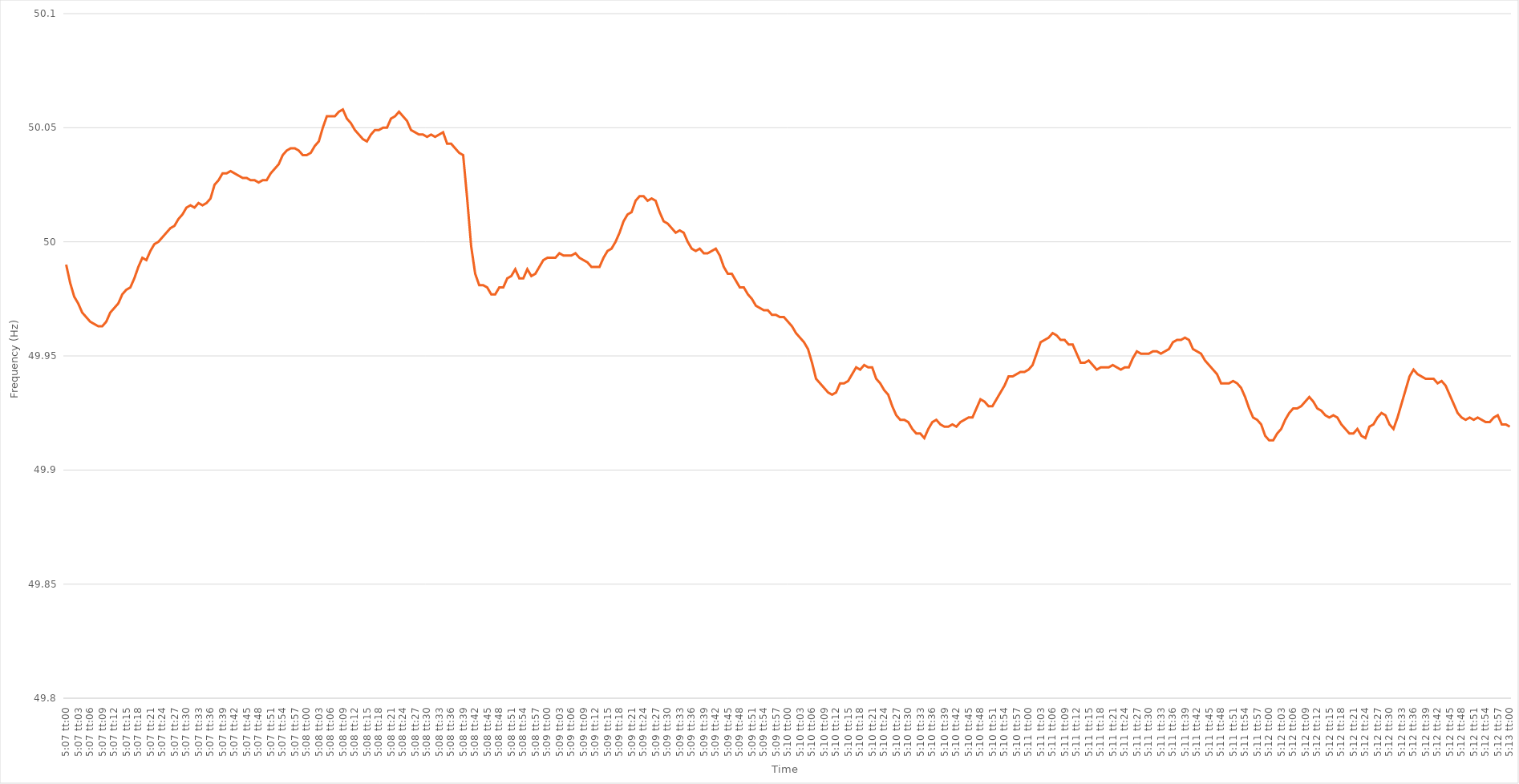
| Category | Series 0 |
|---|---|
| 0.21319444444444444 | 49.99 |
| 0.2132060185185185 | 49.982 |
| 0.21321759259259257 | 49.976 |
| 0.21322916666666666 | 49.973 |
| 0.21324074074074073 | 49.969 |
| 0.2132523148148148 | 49.967 |
| 0.2132638888888889 | 49.965 |
| 0.21327546296296296 | 49.964 |
| 0.21328703703703702 | 49.963 |
| 0.21329861111111112 | 49.963 |
| 0.21331018518518519 | 49.965 |
| 0.21332175925925925 | 49.969 |
| 0.21333333333333335 | 49.971 |
| 0.2133449074074074 | 49.973 |
| 0.21335648148148148 | 49.977 |
| 0.21336805555555557 | 49.979 |
| 0.21337962962962964 | 49.98 |
| 0.2133912037037037 | 49.984 |
| 0.2134027777777778 | 49.989 |
| 0.21341435185185187 | 49.993 |
| 0.2134259259259259 | 49.992 |
| 0.21343749999999997 | 49.996 |
| 0.21344907407407407 | 49.999 |
| 0.21346064814814814 | 50 |
| 0.2134722222222222 | 50.002 |
| 0.2134837962962963 | 50.004 |
| 0.21349537037037036 | 50.006 |
| 0.21350694444444443 | 50.007 |
| 0.21351851851851852 | 50.01 |
| 0.2135300925925926 | 50.012 |
| 0.21354166666666666 | 50.015 |
| 0.21355324074074075 | 50.016 |
| 0.21356481481481482 | 50.015 |
| 0.21357638888888889 | 50.017 |
| 0.21358796296296298 | 50.016 |
| 0.21359953703703705 | 50.017 |
| 0.2136111111111111 | 50.019 |
| 0.2136226851851852 | 50.025 |
| 0.21363425925925927 | 50.027 |
| 0.21364583333333334 | 50.03 |
| 0.21365740740740743 | 50.03 |
| 0.21366898148148147 | 50.031 |
| 0.21368055555555554 | 50.03 |
| 0.2136921296296296 | 50.029 |
| 0.2137037037037037 | 50.028 |
| 0.21371527777777777 | 50.028 |
| 0.21372685185185183 | 50.027 |
| 0.21373842592592593 | 50.027 |
| 0.21375 | 50.026 |
| 0.21376157407407406 | 50.027 |
| 0.21377314814814816 | 50.027 |
| 0.21378472222222222 | 50.03 |
| 0.2137962962962963 | 50.032 |
| 0.21380787037037038 | 50.034 |
| 0.21381944444444445 | 50.038 |
| 0.21383101851851852 | 50.04 |
| 0.2138425925925926 | 50.041 |
| 0.21385416666666668 | 50.041 |
| 0.21386574074074075 | 50.04 |
| 0.21387731481481484 | 50.038 |
| 0.2138888888888889 | 50.038 |
| 0.21390046296296297 | 50.039 |
| 0.213912037037037 | 50.042 |
| 0.2139236111111111 | 50.044 |
| 0.21393518518518517 | 50.05 |
| 0.21394675925925924 | 50.055 |
| 0.21395833333333333 | 50.055 |
| 0.2139699074074074 | 50.055 |
| 0.21398148148148147 | 50.057 |
| 0.21399305555555556 | 50.058 |
| 0.21400462962962963 | 50.054 |
| 0.2140162037037037 | 50.052 |
| 0.2140277777777778 | 50.049 |
| 0.21403935185185186 | 50.047 |
| 0.21405092592592592 | 50.045 |
| 0.21406250000000002 | 50.044 |
| 0.21407407407407408 | 50.047 |
| 0.21408564814814815 | 50.049 |
| 0.21409722222222224 | 50.049 |
| 0.2141087962962963 | 50.05 |
| 0.21412037037037038 | 50.05 |
| 0.21413194444444442 | 50.054 |
| 0.2141435185185185 | 50.055 |
| 0.21415509259259258 | 50.057 |
| 0.21416666666666664 | 50.055 |
| 0.21417824074074074 | 50.053 |
| 0.2141898148148148 | 50.049 |
| 0.21420138888888887 | 50.048 |
| 0.21421296296296297 | 50.047 |
| 0.21422453703703703 | 50.047 |
| 0.2142361111111111 | 50.046 |
| 0.2142476851851852 | 50.047 |
| 0.21425925925925926 | 50.046 |
| 0.21427083333333333 | 50.047 |
| 0.21428240740740742 | 50.048 |
| 0.2142939814814815 | 50.043 |
| 0.21430555555555555 | 50.043 |
| 0.21431712962962965 | 50.041 |
| 0.21432870370370372 | 50.039 |
| 0.21434027777777778 | 50.038 |
| 0.21435185185185188 | 50.019 |
| 0.21436342592592594 | 49.998 |
| 0.21437499999999998 | 49.986 |
| 0.21438657407407405 | 49.981 |
| 0.21439814814814814 | 49.981 |
| 0.2144097222222222 | 49.98 |
| 0.21442129629629628 | 49.977 |
| 0.21443287037037037 | 49.977 |
| 0.21444444444444444 | 49.98 |
| 0.2144560185185185 | 49.98 |
| 0.2144675925925926 | 49.984 |
| 0.21447916666666667 | 49.985 |
| 0.21449074074074073 | 49.988 |
| 0.21450231481481483 | 49.984 |
| 0.2145138888888889 | 49.984 |
| 0.21452546296296296 | 49.988 |
| 0.21453703703703705 | 49.985 |
| 0.21454861111111112 | 49.986 |
| 0.2145601851851852 | 49.989 |
| 0.21457175925925928 | 49.992 |
| 0.21458333333333335 | 49.993 |
| 0.21459490740740741 | 49.993 |
| 0.2146064814814815 | 49.993 |
| 0.21461805555555555 | 49.995 |
| 0.21462962962962961 | 49.994 |
| 0.21464120370370368 | 49.994 |
| 0.21465277777777778 | 49.994 |
| 0.21466435185185184 | 49.995 |
| 0.2146759259259259 | 49.993 |
| 0.2146875 | 49.992 |
| 0.21469907407407407 | 49.991 |
| 0.21471064814814814 | 49.989 |
| 0.21472222222222223 | 49.989 |
| 0.2147337962962963 | 49.989 |
| 0.21474537037037036 | 49.993 |
| 0.21475694444444446 | 49.996 |
| 0.21476851851851853 | 49.997 |
| 0.2147800925925926 | 50 |
| 0.2147916666666667 | 50.004 |
| 0.21480324074074075 | 50.009 |
| 0.21481481481481482 | 50.012 |
| 0.21482638888888891 | 50.013 |
| 0.21483796296296298 | 50.018 |
| 0.21484953703703702 | 50.02 |
| 0.21486111111111109 | 50.02 |
| 0.21487268518518518 | 50.018 |
| 0.21488425925925925 | 50.019 |
| 0.2148958333333333 | 50.018 |
| 0.2149074074074074 | 50.013 |
| 0.21491898148148147 | 50.009 |
| 0.21493055555555554 | 50.008 |
| 0.21494212962962964 | 50.006 |
| 0.2149537037037037 | 50.004 |
| 0.21496527777777777 | 50.005 |
| 0.21497685185185186 | 50.004 |
| 0.21498842592592593 | 50 |
| 0.215 | 49.997 |
| 0.2150115740740741 | 49.996 |
| 0.21502314814814816 | 49.997 |
| 0.21503472222222222 | 49.995 |
| 0.21504629629629632 | 49.995 |
| 0.21505787037037039 | 49.996 |
| 0.21506944444444445 | 49.997 |
| 0.2150810185185185 | 49.994 |
| 0.21509259259259259 | 49.989 |
| 0.21510416666666665 | 49.986 |
| 0.21511574074074072 | 49.986 |
| 0.2151273148148148 | 49.983 |
| 0.21513888888888888 | 49.98 |
| 0.21515046296296295 | 49.98 |
| 0.21516203703703704 | 49.977 |
| 0.2151736111111111 | 49.975 |
| 0.21518518518518517 | 49.972 |
| 0.21519675925925927 | 49.971 |
| 0.21520833333333333 | 49.97 |
| 0.2152199074074074 | 49.97 |
| 0.2152314814814815 | 49.968 |
| 0.21524305555555556 | 49.968 |
| 0.21525462962962963 | 49.967 |
| 0.21526620370370372 | 49.967 |
| 0.2152777777777778 | 49.965 |
| 0.21528935185185186 | 49.963 |
| 0.21530092592592595 | 49.96 |
| 0.21531250000000002 | 49.958 |
| 0.21532407407407406 | 49.956 |
| 0.21533564814814812 | 49.953 |
| 0.21534722222222222 | 49.947 |
| 0.21535879629629628 | 49.94 |
| 0.21537037037037035 | 49.938 |
| 0.21538194444444445 | 49.936 |
| 0.2153935185185185 | 49.934 |
| 0.21540509259259258 | 49.933 |
| 0.21541666666666667 | 49.934 |
| 0.21542824074074074 | 49.938 |
| 0.2154398148148148 | 49.938 |
| 0.2154513888888889 | 49.939 |
| 0.21546296296296297 | 49.942 |
| 0.21547453703703703 | 49.945 |
| 0.21548611111111113 | 49.944 |
| 0.2154976851851852 | 49.946 |
| 0.21550925925925926 | 49.945 |
| 0.21552083333333336 | 49.945 |
| 0.21553240740740742 | 49.94 |
| 0.2155439814814815 | 49.938 |
| 0.21555555555555558 | 49.935 |
| 0.21556712962962962 | 49.933 |
| 0.2155787037037037 | 49.928 |
| 0.21559027777777776 | 49.924 |
| 0.21560185185185185 | 49.922 |
| 0.21561342592592592 | 49.922 |
| 0.21562499999999998 | 49.921 |
| 0.21563657407407408 | 49.918 |
| 0.21564814814814814 | 49.916 |
| 0.2156597222222222 | 49.916 |
| 0.2156712962962963 | 49.914 |
| 0.21568287037037037 | 49.918 |
| 0.21569444444444444 | 49.921 |
| 0.21570601851851853 | 49.922 |
| 0.2157175925925926 | 49.92 |
| 0.21572916666666667 | 49.919 |
| 0.21574074074074076 | 49.919 |
| 0.21575231481481483 | 49.92 |
| 0.2157638888888889 | 49.919 |
| 0.215775462962963 | 49.921 |
| 0.21578703703703703 | 49.922 |
| 0.2157986111111111 | 49.923 |
| 0.21581018518518516 | 49.923 |
| 0.21582175925925925 | 49.927 |
| 0.21583333333333332 | 49.931 |
| 0.2158449074074074 | 49.93 |
| 0.21585648148148148 | 49.928 |
| 0.21586805555555555 | 49.928 |
| 0.21587962962962962 | 49.931 |
| 0.2158912037037037 | 49.934 |
| 0.21590277777777778 | 49.937 |
| 0.21591435185185184 | 49.941 |
| 0.21592592592592594 | 49.941 |
| 0.2159375 | 49.942 |
| 0.21594907407407407 | 49.943 |
| 0.21596064814814817 | 49.943 |
| 0.21597222222222223 | 49.944 |
| 0.2159837962962963 | 49.946 |
| 0.2159953703703704 | 49.951 |
| 0.21600694444444446 | 49.956 |
| 0.21601851851851853 | 49.957 |
| 0.21603009259259257 | 49.958 |
| 0.21604166666666666 | 49.96 |
| 0.21605324074074073 | 49.959 |
| 0.2160648148148148 | 49.957 |
| 0.2160763888888889 | 49.957 |
| 0.21608796296296295 | 49.955 |
| 0.21609953703703702 | 49.955 |
| 0.21611111111111111 | 49.951 |
| 0.21612268518518518 | 49.947 |
| 0.21613425925925925 | 49.947 |
| 0.21614583333333334 | 49.948 |
| 0.2161574074074074 | 49.946 |
| 0.21616898148148148 | 49.944 |
| 0.21618055555555557 | 49.945 |
| 0.21619212962962964 | 49.945 |
| 0.2162037037037037 | 49.945 |
| 0.2162152777777778 | 49.946 |
| 0.21622685185185186 | 49.945 |
| 0.21623842592592593 | 49.944 |
| 0.21625000000000003 | 49.945 |
| 0.2162615740740741 | 49.945 |
| 0.21627314814814813 | 49.949 |
| 0.2162847222222222 | 49.952 |
| 0.2162962962962963 | 49.951 |
| 0.21630787037037036 | 49.951 |
| 0.21631944444444443 | 49.951 |
| 0.21633101851851852 | 49.952 |
| 0.2163425925925926 | 49.952 |
| 0.21635416666666665 | 49.951 |
| 0.21636574074074075 | 49.952 |
| 0.21637731481481481 | 49.953 |
| 0.21638888888888888 | 49.956 |
| 0.21640046296296298 | 49.957 |
| 0.21641203703703704 | 49.957 |
| 0.2164236111111111 | 49.958 |
| 0.2164351851851852 | 49.957 |
| 0.21644675925925927 | 49.953 |
| 0.21645833333333334 | 49.952 |
| 0.21646990740740743 | 49.951 |
| 0.2164814814814815 | 49.948 |
| 0.21649305555555556 | 49.946 |
| 0.21650462962962966 | 49.944 |
| 0.2165162037037037 | 49.942 |
| 0.21652777777777776 | 49.938 |
| 0.21653935185185183 | 49.938 |
| 0.21655092592592592 | 49.938 |
| 0.2165625 | 49.939 |
| 0.21657407407407406 | 49.938 |
| 0.21658564814814815 | 49.936 |
| 0.21659722222222222 | 49.932 |
| 0.21660879629629629 | 49.927 |
| 0.21662037037037038 | 49.923 |
| 0.21663194444444445 | 49.922 |
| 0.2166435185185185 | 49.92 |
| 0.2166550925925926 | 49.915 |
| 0.21666666666666667 | 49.913 |
| 0.21667824074074074 | 49.913 |
| 0.21668981481481484 | 49.916 |
| 0.2167013888888889 | 49.918 |
| 0.21671296296296297 | 49.922 |
| 0.21672453703703706 | 49.925 |
| 0.2167361111111111 | 49.927 |
| 0.21674768518518517 | 49.927 |
| 0.21675925925925923 | 49.928 |
| 0.21677083333333333 | 49.93 |
| 0.2167824074074074 | 49.932 |
| 0.21679398148148146 | 49.93 |
| 0.21680555555555556 | 49.927 |
| 0.21681712962962962 | 49.926 |
| 0.2168287037037037 | 49.924 |
| 0.21684027777777778 | 49.923 |
| 0.21685185185185185 | 49.924 |
| 0.21686342592592592 | 49.923 |
| 0.216875 | 49.92 |
| 0.21688657407407408 | 49.918 |
| 0.21689814814814815 | 49.916 |
| 0.21690972222222224 | 49.916 |
| 0.2169212962962963 | 49.918 |
| 0.21693287037037037 | 49.915 |
| 0.21694444444444447 | 49.914 |
| 0.21695601851851853 | 49.919 |
| 0.2169675925925926 | 49.92 |
| 0.21697916666666664 | 49.923 |
| 0.21699074074074073 | 49.925 |
| 0.2170023148148148 | 49.924 |
| 0.21701388888888887 | 49.92 |
| 0.21702546296296296 | 49.918 |
| 0.21703703703703703 | 49.923 |
| 0.2170486111111111 | 49.929 |
| 0.2170601851851852 | 49.935 |
| 0.21707175925925926 | 49.941 |
| 0.21708333333333332 | 49.944 |
| 0.21709490740740742 | 49.942 |
| 0.21710648148148148 | 49.941 |
| 0.21711805555555555 | 49.94 |
| 0.21712962962962964 | 49.94 |
| 0.2171412037037037 | 49.94 |
| 0.21715277777777778 | 49.938 |
| 0.21716435185185187 | 49.939 |
| 0.21717592592592594 | 49.937 |
| 0.2171875 | 49.933 |
| 0.2171990740740741 | 49.929 |
| 0.21721064814814817 | 49.925 |
| 0.2172222222222222 | 49.923 |
| 0.21723379629629627 | 49.922 |
| 0.21724537037037037 | 49.923 |
| 0.21725694444444443 | 49.922 |
| 0.2172685185185185 | 49.923 |
| 0.2172800925925926 | 49.922 |
| 0.21729166666666666 | 49.921 |
| 0.21730324074074073 | 49.921 |
| 0.21731481481481482 | 49.923 |
| 0.2173263888888889 | 49.924 |
| 0.21733796296296296 | 49.92 |
| 0.21734953703703705 | 49.92 |
| 0.21736111111111112 | 49.919 |